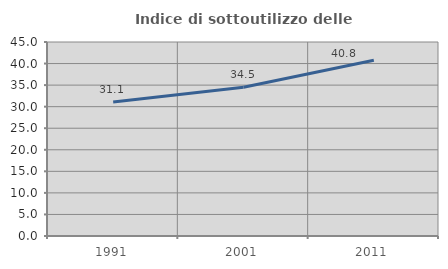
| Category | Indice di sottoutilizzo delle abitazioni  |
|---|---|
| 1991.0 | 31.081 |
| 2001.0 | 34.521 |
| 2011.0 | 40.783 |